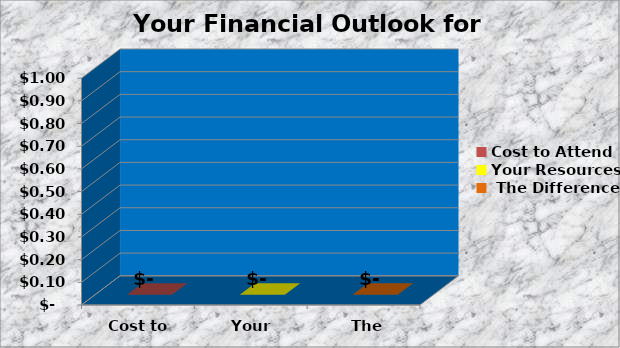
| Category | Series 0 |
|---|---|
| Cost to Attend | 0 |
| Your Resources | 0 |
| The Difference | 0 |